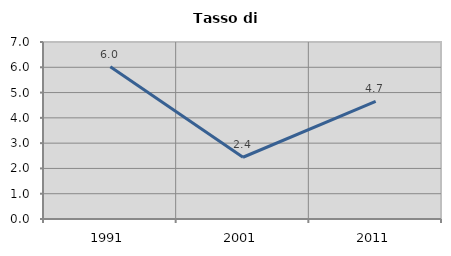
| Category | Tasso di disoccupazione   |
|---|---|
| 1991.0 | 6.023 |
| 2001.0 | 2.442 |
| 2011.0 | 4.652 |